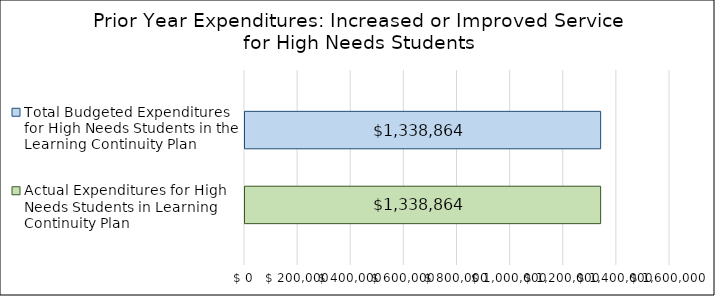
| Category | Actual Expenditures for High Needs Students in Learning Continuity Plan | Total Budgeted Expenditures for High Needs Students in the Learning Continuity Plan |
|---|---|---|
| 0 | 1338864 | 1338864 |